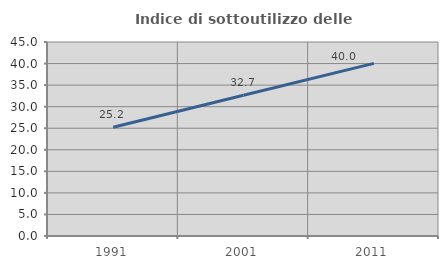
| Category | Indice di sottoutilizzo delle abitazioni  |
|---|---|
| 1991.0 | 25.22 |
| 2001.0 | 32.664 |
| 2011.0 | 40.037 |